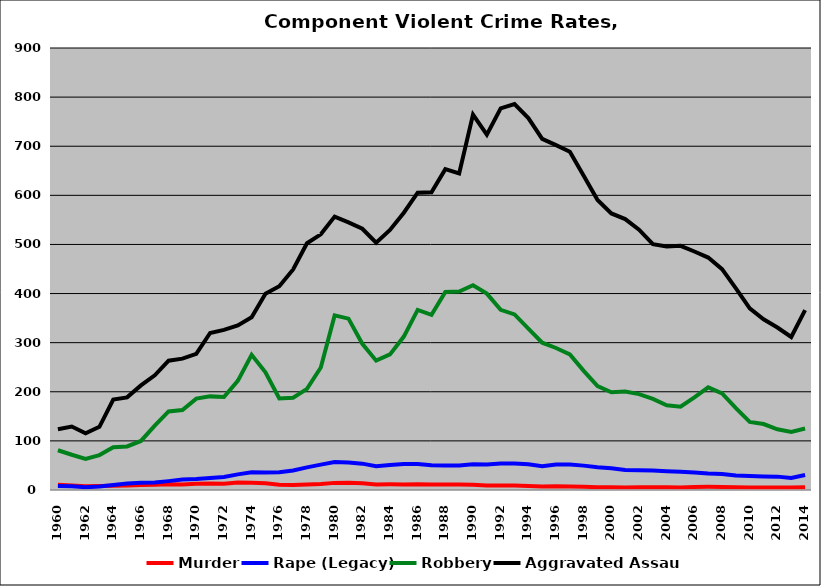
| Category | Murder | Rape (Legacy) | Robbery | Aggravated Assault |
|---|---|---|---|---|
| 1960.0 | 10.643 | 8.139 | 80.884 | 123.719 |
| 1961.0 | 9.134 | 7.622 | 71.735 | 129.357 |
| 1962.0 | 7.694 | 5.825 | 63.327 | 115.296 |
| 1963.0 | 8.192 | 7.042 | 71.072 | 128.662 |
| 1964.0 | 8.571 | 10.324 | 86.906 | 184.102 |
| 1965.0 | 8.923 | 13.282 | 88.648 | 188.648 |
| 1966.0 | 10.301 | 14.661 | 99.865 | 212.978 |
| 1967.0 | 10.509 | 15.229 | 130.942 | 233.628 |
| 1968.0 | 11.867 | 18.068 | 159.886 | 263.312 |
| 1969.0 | 11.331 | 21.199 | 162.811 | 267.532 |
| 1970.0 | 12.667 | 22.226 | 186.112 | 277.18 |
| 1971.0 | 13.251 | 24.258 | 190.626 | 319.727 |
| 1972.0 | 12.729 | 26.45 | 189.351 | 325.982 |
| 1973.0 | 15.369 | 31.87 | 222.31 | 335.022 |
| 1974.0 | 14.722 | 35.97 | 275.192 | 351.755 |
| 1975.0 | 13.522 | 35.731 | 239.691 | 399.581 |
| 1976.0 | 10.723 | 36.278 | 186.379 | 414.963 |
| 1977.0 | 10.163 | 39.612 | 187.944 | 449.124 |
| 1978.0 | 11.043 | 46.079 | 205.969 | 502.467 |
| 1979.0 | 12.235 | 51.648 | 249.402 | 520.587 |
| 1980.0 | 14.498 | 56.851 | 355.541 | 556.636 |
| 1981.0 | 14.971 | 56.138 | 348.938 | 545.023 |
| 1982.0 | 13.527 | 53.639 | 297.638 | 531.999 |
| 1983.0 | 11.227 | 48.408 | 263.352 | 503.717 |
| 1984.0 | 11.516 | 50.747 | 276.157 | 529.565 |
| 1985.0 | 11.402 | 52.824 | 312.388 | 564.535 |
| 1986.0 | 11.743 | 52.694 | 366.784 | 605.293 |
| 1987.0 | 11.403 | 50.171 | 356.558 | 606.305 |
| 1988.0 | 11.441 | 49.721 | 403.296 | 653.284 |
| 1989.0 | 11.088 | 49.712 | 403.978 | 644.645 |
| 1990.0 | 10.659 | 52.412 | 416.821 | 764.435 |
| 1991.0 | 9.4 | 51.706 | 399.812 | 723.409 |
| 1992.0 | 8.956 | 54.196 | 366.859 | 777.187 |
| 1993.0 | 8.948 | 53.798 | 357.577 | 785.723 |
| 1994.0 | 8.349 | 52.326 | 328.754 | 757.393 |
| 1995.0 | 7.32 | 48.616 | 299.908 | 715.107 |
| 1996.0 | 7.479 | 52.139 | 289.188 | 702.236 |
| 1997.0 | 6.906 | 51.856 | 276.095 | 688.727 |
| 1998.0 | 6.483 | 49.638 | 242.679 | 639.897 |
| 1999.0 | 5.685 | 46.257 | 211.558 | 590.461 |
| 2000.0 | 5.65 | 44.155 | 199.025 | 563.17 |
| 2001.0 | 5.338 | 40.56 | 200.735 | 551.696 |
| 2002.0 | 5.458 | 40.457 | 195.193 | 530.06 |
| 2003.0 | 5.436 | 39.572 | 185.438 | 500.648 |
| 2004.0 | 5.441 | 38.032 | 172.541 | 495.812 |
| 2005.0 | 4.97 | 37.1 | 169.635 | 497.186 |
| 2006.0 | 6.241 | 35.793 | 188.763 | 485.636 |
| 2007.0 | 6.586 | 33.696 | 209.06 | 473.25 |
| 2008.0 | 6.345 | 32.414 | 196.859 | 449.688 |
| 2009.0 | 5.486 | 29.674 | 166.744 | 410.574 |
| 2010.0 | 5.25 | 28.578 | 138.746 | 369.777 |
| 2011.0 | 5.157 | 27.633 | 134.271 | 347.543 |
| 2012.0 | 5.222 | 27.225 | 123.644 | 330.883 |
| 2013.0 | 4.959 | 24.311 | 118.365 | 311.495 |
| 2014.0 | 5.776 | 30.417 | 125.238 | 366.43 |